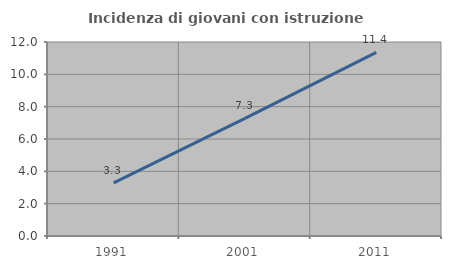
| Category | Incidenza di giovani con istruzione universitaria |
|---|---|
| 1991.0 | 3.285 |
| 2001.0 | 7.273 |
| 2011.0 | 11.355 |